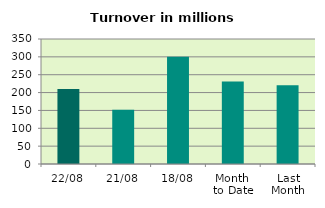
| Category | Series 0 |
|---|---|
| 22/08 | 210.063 |
| 21/08 | 152.221 |
| 18/08 | 300.18 |
| Month 
to Date | 231.143 |
| Last
Month | 220.762 |